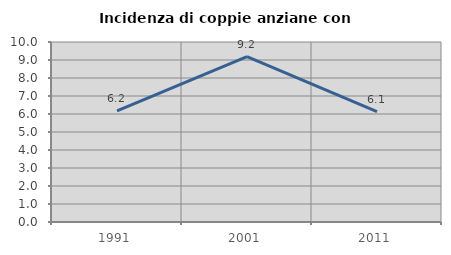
| Category | Incidenza di coppie anziane con figli |
|---|---|
| 1991.0 | 6.168 |
| 2001.0 | 9.187 |
| 2011.0 | 6.126 |